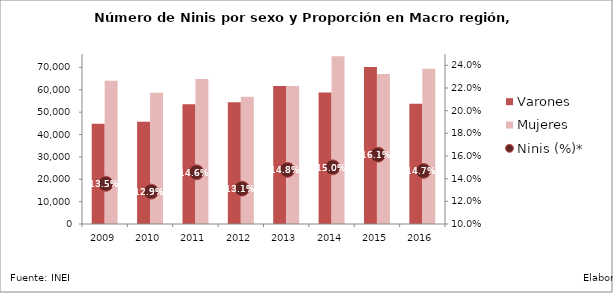
| Category | Varones | Mujeres |
|---|---|---|
| 2009.0 | 44820.83 | 64033.71 |
| 2010.0 | 45764.69 | 58659.42 |
| 2011.0 | 53500.7 | 64792.22 |
| 2012.0 | 54404.21 | 56858.19 |
| 2013.0 | 61703.74 | 61655.27 |
| 2014.0 | 58836.33 | 74950.71 |
| 2015.0 | 70221.56 | 67026.43 |
| 2016.0 | 53754.44 | 69377.73 |